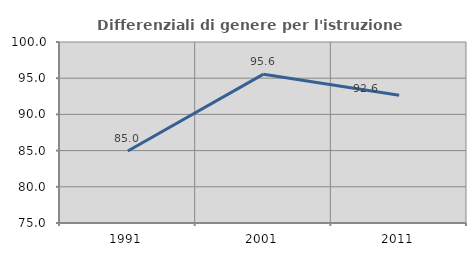
| Category | Differenziali di genere per l'istruzione superiore |
|---|---|
| 1991.0 | 84.953 |
| 2001.0 | 95.56 |
| 2011.0 | 92.639 |